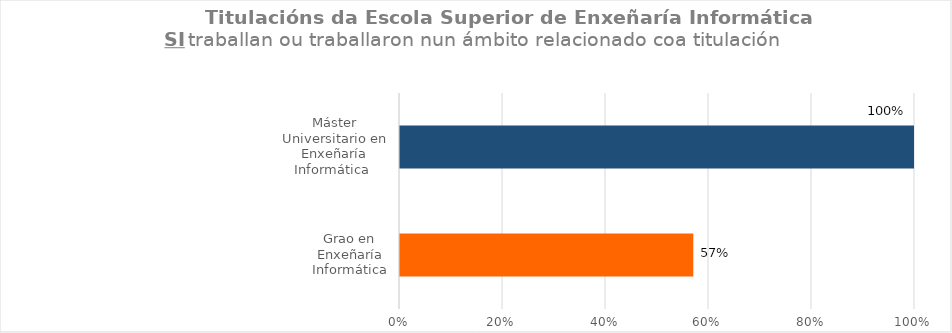
| Category | Series 1 |
|---|---|
| Grao en Enxeñaría Informática | 0.571 |
| Máster Universitario en Enxeñaría Informática  | 1 |